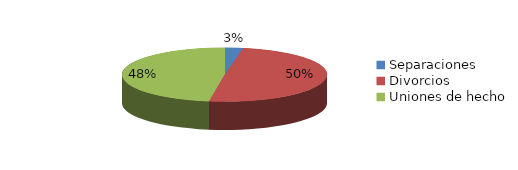
| Category | Series 0 |
|---|---|
| Separaciones | 51 |
| Divorcios | 874 |
| Uniones de hecho | 840 |